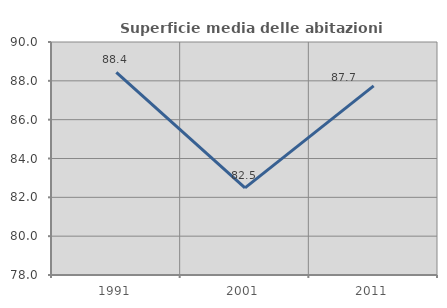
| Category | Superficie media delle abitazioni occupate |
|---|---|
| 1991.0 | 88.441 |
| 2001.0 | 82.491 |
| 2011.0 | 87.743 |